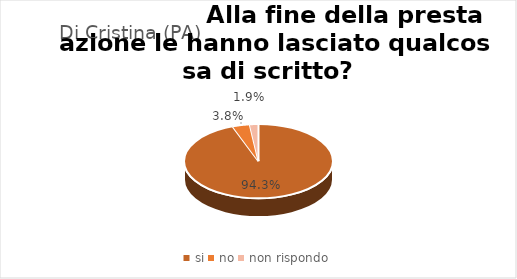
| Category | Amb Osp Dei Bambini G. Di Cristina (PA) |
|---|---|
| si | 0.943 |
| no | 0.038 |
| non rispondo | 0.019 |